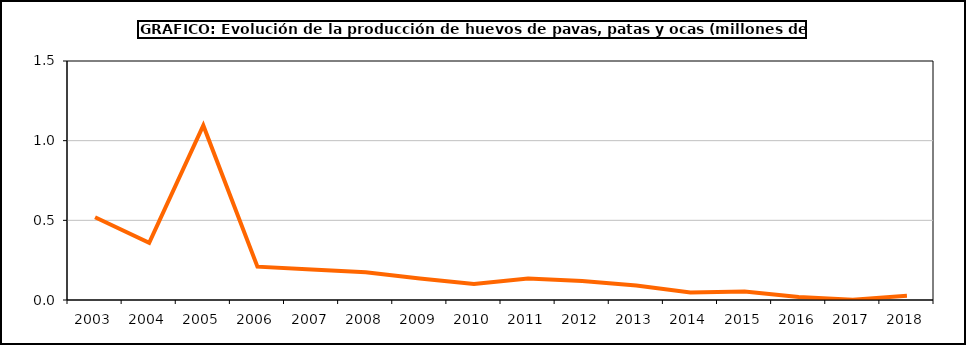
| Category | huevos |
|---|---|
| 2003.0 | 0.519 |
| 2004.0 | 0.358 |
| 2005.0 | 1.095 |
| 2006.0 | 0.209 |
| 2007.0 | 0.191 |
| 2008.0 | 0.174 |
| 2009.0 | 0.135 |
| 2010.0 | 0.1 |
| 2011.0 | 0.135 |
| 2012.0 | 0.119 |
| 2013.0 | 0.09 |
| 2014.0 | 0.047 |
| 2015.0 | 0.054 |
| 2016.0 | 0.019 |
| 2017.0 | 0.002 |
| 2018.0 | 0.027 |